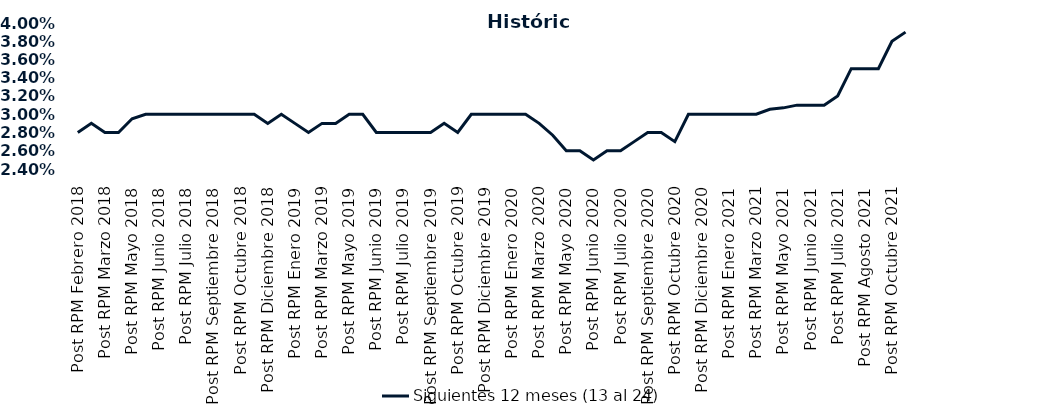
| Category | Siguientes 12 meses (13 al 24)  |
|---|---|
| Post RPM Febrero 2018 | 0.028 |
| Pre RPM Marzo 2018 | 0.029 |
| Post RPM Marzo 2018 | 0.028 |
| Pre RPM Mayo 2018 | 0.028 |
| Post RPM Mayo 2018 | 0.03 |
| Pre RPM Junio 2018 | 0.03 |
| Post RPM Junio 2018 | 0.03 |
| Pre RPM Julio 2018 | 0.03 |
| Post RPM Julio 2018 | 0.03 |
| Pre RPM Septiembre 2018 | 0.03 |
| Post RPM Septiembre 2018 | 0.03 |
| Pre RPM Octubre 2018 | 0.03 |
| Post RPM Octubre 2018 | 0.03 |
| Pre RPM Diciembre 2018 | 0.03 |
| Post RPM Diciembre 2018 | 0.029 |
| Pre RPM Enero 2019 | 0.03 |
| Post RPM Enero 2019 | 0.029 |
| Pre RPM Marzo 2019 | 0.028 |
| Post RPM Marzo 2019 | 0.029 |
| Pre RPM Mayo 2019 | 0.029 |
| Post RPM Mayo 2019 | 0.03 |
| Pre RPM Junio 2019 | 0.03 |
| Post RPM Junio 2019 | 0.028 |
| Pre RPM Julio 2019 | 0.028 |
| Post RPM Julio 2019 | 0.028 |
| Pre RPM Septiembre 2019 | 0.028 |
| Post RPM Septiembre 2019 | 0.028 |
| Pre RPM Octubre 2019 | 0.029 |
| Post RPM Octubre 2019 | 0.028 |
| Pre RPM Diciembre 2019 | 0.03 |
| Post RPM Diciembre 2019 | 0.03 |
| Pre RPM Enero 2020 | 0.03 |
| Post RPM Enero 2020 | 0.03 |
| Pre RPM Marzo 2020 | 0.03 |
| Post RPM Marzo 2020 | 0.029 |
| Pre RPM Mayo 2020 | 0.028 |
| Post RPM Mayo 2020 | 0.026 |
| Pre RPM Junio 2020 | 0.026 |
| Post RPM Junio 2020 | 0.025 |
| Pre RPM Julio 2020 | 0.026 |
| Post RPM Julio 2020 | 0.026 |
| Pre RPM Septiembre 2020 | 0.027 |
| Post RPM Septiembre 2020 | 0.028 |
| Pre RPM Octubre 2020 | 0.028 |
| Post RPM Octubre 2020 | 0.027 |
| Pre RPM Diciembre 2020 | 0.03 |
| Post RPM Diciembre 2020 | 0.03 |
| Pre RPM Enero 2021 | 0.03 |
| Post RPM Enero 2021 | 0.03 |
| Pre RPM Marzo 2021 | 0.03 |
| Post RPM Marzo 2021 | 0.03 |
| Pre RPM Mayo 2021 | 0.031 |
| Post RPM Mayo 2021 | 0.031 |
| Pre RPM Junio 2021 | 0.031 |
| Post RPM Junio 2021 | 0.031 |
| Pre RPM Julio 2021 | 0.031 |
| Post RPM Julio 2021 | 0.032 |
| Pre RPM Agosto 2021 | 0.035 |
| Post RPM Agosto 2021 | 0.035 |
| Pre RPM Octubre 2021 | 0.035 |
| Post RPM Octubre 2021 | 0.038 |
| Pre RPM Diciembre 2021 | 0.039 |